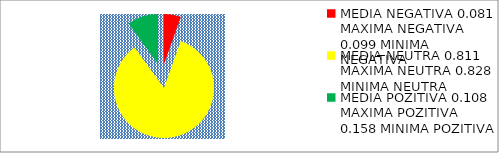
| Category | Series 0 |
|---|---|
| 0 | 0.051 |
| 1 | 0.792 |
| 2 | 0.094 |